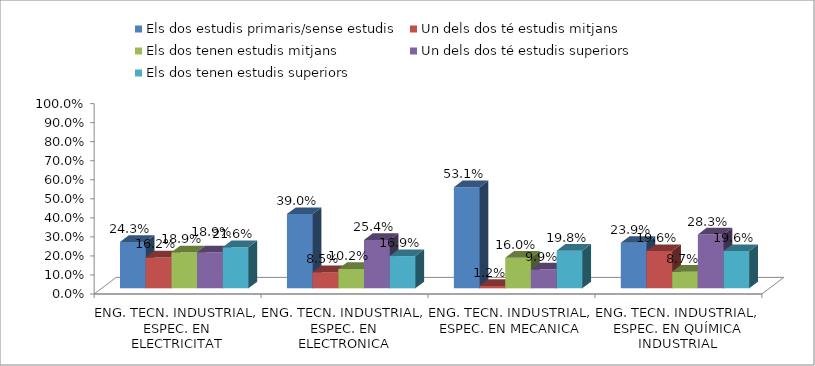
| Category | Els dos estudis primaris/sense estudis | Un dels dos té estudis mitjans | Els dos tenen estudis mitjans | Un dels dos té estudis superiors | Els dos tenen estudis superiors |
|---|---|---|---|---|---|
| ENG. TECN. INDUSTRIAL, ESPEC. EN ELECTRICITAT | 0.243 | 0.162 | 0.189 | 0.189 | 0.216 |
| ENG. TECN. INDUSTRIAL, ESPEC. EN ELECTRONICA INDUSTRIAL | 0.39 | 0.085 | 0.102 | 0.254 | 0.169 |
| ENG. TECN. INDUSTRIAL, ESPEC. EN MECANICA | 0.531 | 0.012 | 0.16 | 0.099 | 0.198 |
| ENG. TECN. INDUSTRIAL, ESPEC. EN QUÍMICA INDUSTRIAL | 0.239 | 0.196 | 0.087 | 0.283 | 0.196 |